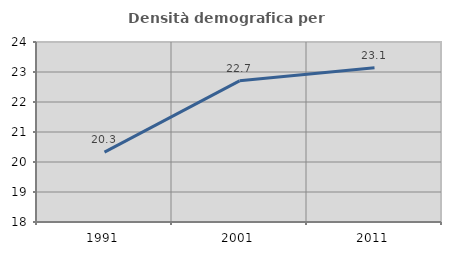
| Category | Densità demografica |
|---|---|
| 1991.0 | 20.331 |
| 2001.0 | 22.705 |
| 2011.0 | 23.144 |